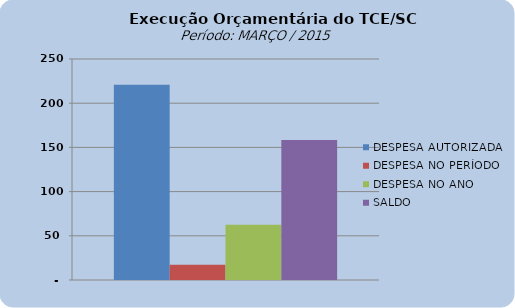
| Category | DESPESA AUTORIZADA | DESPESA NO PERÍODO | DESPESA NO ANO | SALDO |
|---|---|---|---|---|
| 0 | 221007123.35 | 17369360.1 | 62550710.29 | 158456413.06 |